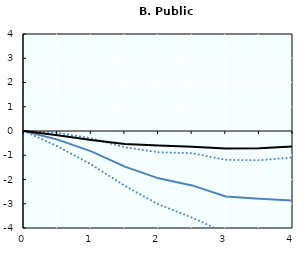
| Category | Effect during bust | confidence lower | confidence upper | Average effect |
|---|---|---|---|---|
| 0.0 | 0 | 0 | 0 | 0 |
| nan | -0.355 | -0.635 | -0.075 | -0.179 |
| 1.0 | -0.841 | -1.381 | -0.301 | -0.373 |
| nan | -1.467 | -2.263 | -0.671 | -0.537 |
| 2.0 | -1.952 | -3.028 | -0.875 | -0.595 |
| nan | -2.243 | -3.57 | -0.917 | -0.646 |
| 3.0 | -2.697 | -4.206 | -1.189 | -0.716 |
| nan | -2.793 | -4.379 | -1.206 | -0.711 |
| 4.0 | -2.87 | -4.652 | -1.088 | -0.637 |